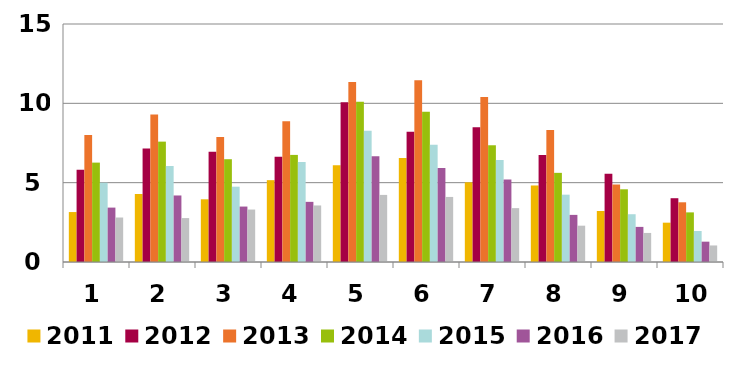
| Category | 2011 | 2012 | 2013 | 2014 | 2015 | 2016 | 2017 |
|---|---|---|---|---|---|---|---|
| 1.0 | 3.148 | 5.811 | 7.998 | 6.264 | 4.997 | 3.429 | 2.804 |
| 2.0 | 4.287 | 7.16 | 9.303 | 7.587 | 6.054 | 4.193 | 2.768 |
| 3.0 | 3.952 | 6.951 | 7.88 | 6.478 | 4.747 | 3.494 | 3.306 |
| 4.0 | 5.157 | 6.636 | 8.873 | 6.75 | 6.3 | 3.791 | 3.564 |
| 5.0 | 6.099 | 10.07 | 11.352 | 10.095 | 8.272 | 6.672 | 4.229 |
| 6.0 | 6.56 | 8.206 | 11.454 | 9.47 | 7.392 | 5.926 | 4.101 |
| 7.0 | 5.023 | 8.498 | 10.406 | 7.358 | 6.428 | 5.199 | 3.395 |
| 8.0 | 4.823 | 6.747 | 8.327 | 5.619 | 4.244 | 2.97 | 2.289 |
| 9.0 | 3.215 | 5.558 | 4.884 | 4.582 | 3.011 | 2.213 | 1.832 |
| 10.0 | 2.478 | 4.02 | 3.763 | 3.127 | 1.954 | 1.282 | 1.042 |